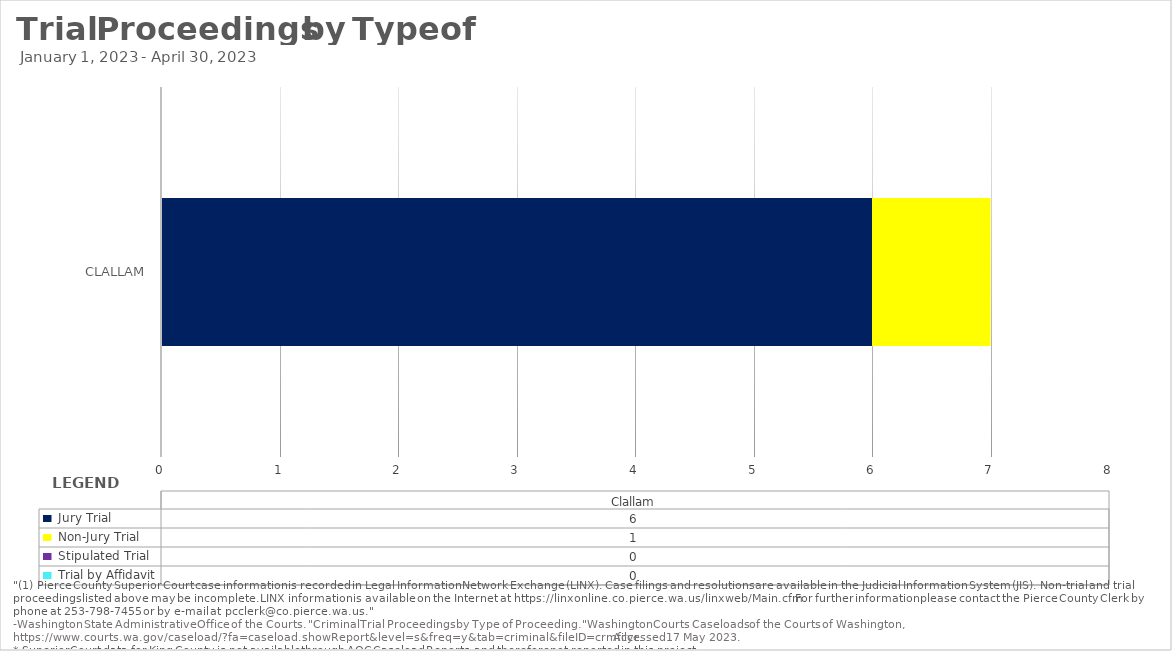
| Category |  Jury Trial  |  Non-Jury Trial  |  Stipulated Trial  |  Trial by Affidavit  |
|---|---|---|---|---|
| Clallam | 6 | 1 | 0 | 0 |